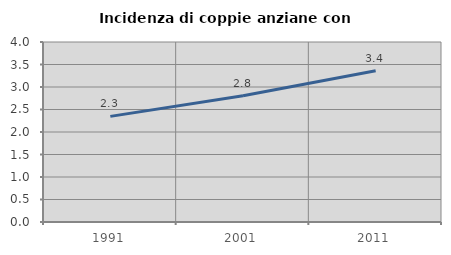
| Category | Incidenza di coppie anziane con figli |
|---|---|
| 1991.0 | 2.347 |
| 2001.0 | 2.807 |
| 2011.0 | 3.36 |